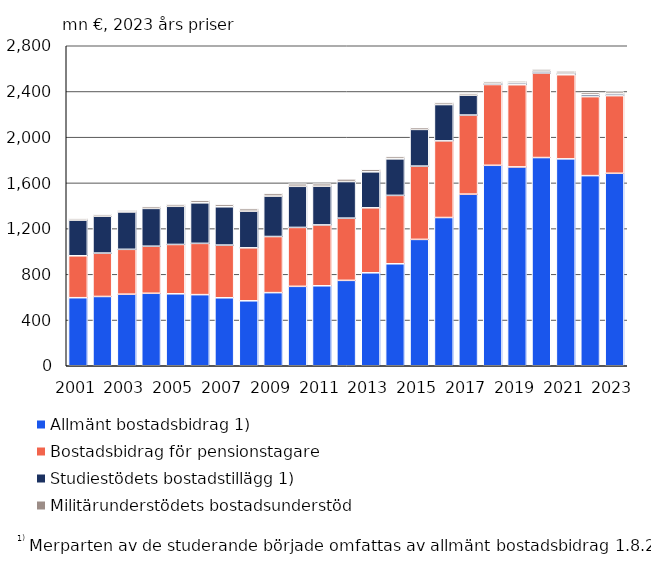
| Category | Allmänt bostadsbidrag 1) | Bostadsbidrag för pensionstagare | Studiestödets bostadstillägg 1) | Militärunderstödets bostadsunderstöd |
|---|---|---|---|---|
| 2001.0 | 595.479 | 366.764 | 311.961 | 13.866 |
| 2002.0 | 606.242 | 379.663 | 322.622 | 15.718 |
| 2003.0 | 626.182 | 392.523 | 327.294 | 16.453 |
| 2004.0 | 634.133 | 411.809 | 330.935 | 18.308 |
| 2005.0 | 629.631 | 431.796 | 333.822 | 19.309 |
| 2006.0 | 622.233 | 448.702 | 354.835 | 20.957 |
| 2007.0 | 594.811 | 461.102 | 335.127 | 20.715 |
| 2008.0 | 568.394 | 463.468 | 321.028 | 21.896 |
| 2009.0 | 639.76 | 491.136 | 353.831 | 22.864 |
| 2010.0 | 694.922 | 515.577 | 359.686 | 22.051 |
| 2011.0 | 699.84 | 532.431 | 338.568 | 22.122 |
| 2012.0 | 747.186 | 544.406 | 320.235 | 23.057 |
| 2013.0 | 813.443 | 568.644 | 314.964 | 21.469 |
| 2014.0 | 892.244 | 598.443 | 319.77 | 19.838 |
| 2015.0 | 1105.732 | 641.245 | 321.077 | 18.723 |
| 2016.0 | 1297.156 | 670.766 | 317.489 | 17.888 |
| 2017.0 | 1501.613 | 692.007 | 173.433 | 18.52 |
| 2018.0 | 1753.971 | 706.93 | 10.896 | 16.433 |
| 2019.0 | 1739.939 | 719.105 | 15.743 | 17.318 |
| 2020.0 | 1821.816 | 739.935 | 16.154 | 18.608 |
| 2021.0 | 1810.296 | 736.218 | 14.168 | 19.005 |
| 2022.0 | 1663.606 | 691.194 | 16.668 | 19.453 |
| 2023.0 | 1684.21 | 679.21 | 15.62 | 19.46 |